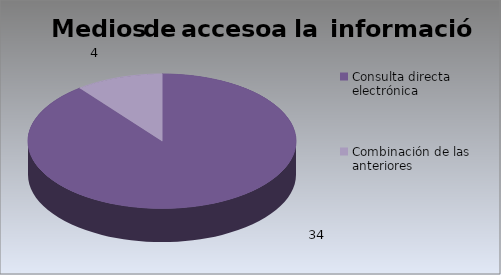
| Category | Series 0 |
|---|---|
| Consulta directa electrónica | 34 |
| Combinación de las anteriores | 4 |